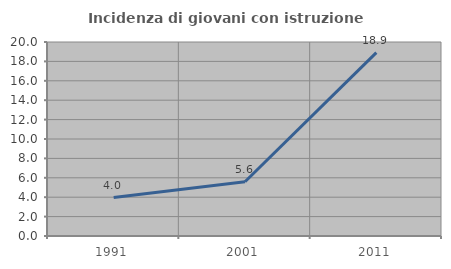
| Category | Incidenza di giovani con istruzione universitaria |
|---|---|
| 1991.0 | 3.968 |
| 2001.0 | 5.594 |
| 2011.0 | 18.898 |